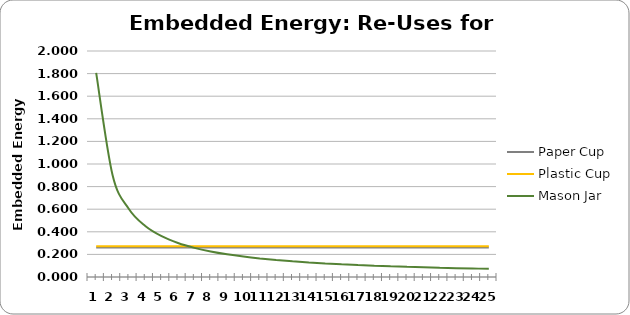
| Category | Paper Cup | Plastic Cup | Mason Jar |
|---|---|---|---|
| 0 | 0.262 | 0.273 | 1.806 |
| 1 | 0.262 | 0.273 | 0.903 |
| 2 | 0.262 | 0.273 | 0.602 |
| 3 | 0.262 | 0.273 | 0.451 |
| 4 | 0.262 | 0.273 | 0.361 |
| 5 | 0.262 | 0.273 | 0.301 |
| 6 | 0.262 | 0.273 | 0.258 |
| 7 | 0.262 | 0.273 | 0.226 |
| 8 | 0.262 | 0.273 | 0.201 |
| 9 | 0.262 | 0.273 | 0.181 |
| 10 | 0.262 | 0.273 | 0.164 |
| 11 | 0.262 | 0.273 | 0.15 |
| 12 | 0.262 | 0.273 | 0.139 |
| 13 | 0.262 | 0.273 | 0.129 |
| 14 | 0.262 | 0.273 | 0.12 |
| 15 | 0.262 | 0.273 | 0.113 |
| 16 | 0.262 | 0.273 | 0.106 |
| 17 | 0.262 | 0.273 | 0.1 |
| 18 | 0.262 | 0.273 | 0.095 |
| 19 | 0.262 | 0.273 | 0.09 |
| 20 | 0.262 | 0.273 | 0.086 |
| 21 | 0.262 | 0.273 | 0.082 |
| 22 | 0.262 | 0.273 | 0.079 |
| 23 | 0.262 | 0.273 | 0.075 |
| 24 | 0.262 | 0.273 | 0.072 |